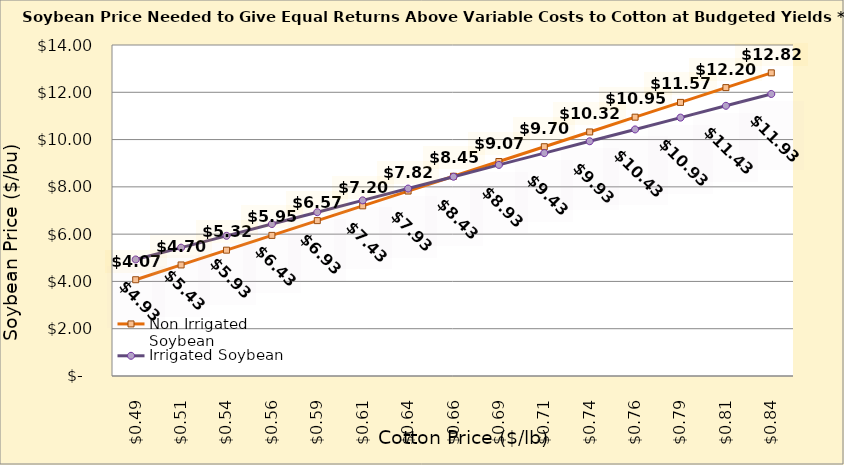
| Category | Non Irrigated Soybean | Irrigated Soybean |
|---|---|---|
| 0.4849999999999999 | 4.072 | 4.928 |
| 0.5099999999999999 | 4.697 | 5.428 |
| 0.5349999999999999 | 5.322 | 5.928 |
| 0.5599999999999999 | 5.947 | 6.428 |
| 0.585 | 6.572 | 6.928 |
| 0.61 | 7.197 | 7.428 |
| 0.635 | 7.822 | 7.928 |
| 0.66 | 8.447 | 8.428 |
| 0.685 | 9.072 | 8.928 |
| 0.7100000000000001 | 9.697 | 9.428 |
| 0.7350000000000001 | 10.322 | 9.928 |
| 0.7600000000000001 | 10.947 | 10.428 |
| 0.7850000000000001 | 11.572 | 10.928 |
| 0.8100000000000002 | 12.197 | 11.428 |
| 0.8350000000000002 | 12.822 | 11.928 |